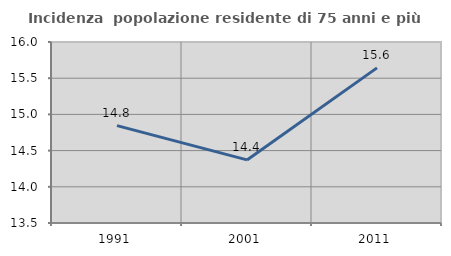
| Category | Incidenza  popolazione residente di 75 anni e più |
|---|---|
| 1991.0 | 14.845 |
| 2001.0 | 14.371 |
| 2011.0 | 15.643 |